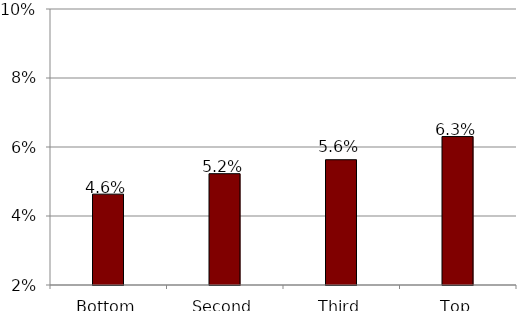
| Category | Series 1 |
|---|---|
| Bottom | 0.046 |
| Second | 0.052 |
| Third | 0.056 |
| Top | 0.063 |